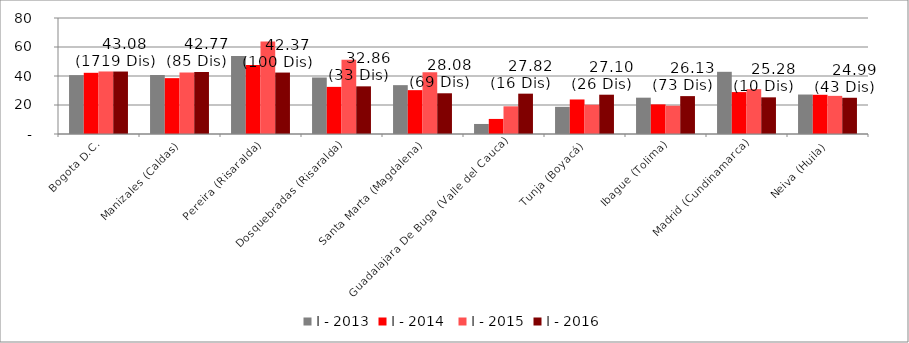
| Category | I - 2013 | I - 2014  | I - 2015 | I - 2016 |
|---|---|---|---|---|
| Bogota D.C. | 40.603 | 42.202 | 43.128 | 43.083 |
| Manizales (Caldas) | 40.693 | 38.515 | 42.413 | 42.769 |
| Pereira (Risaralda) | 53.794 | 47.516 | 63.878 | 42.371 |
| Dosquebradas (Risaralda) | 38.979 | 32.5 | 51.289 | 32.864 |
| Santa Marta (Magdalena) | 33.691 | 30.235 | 42.586 | 28.084 |
| Guadalajara De Buga (Valle del Cauca) | 6.92 | 10.396 | 19.089 | 27.819 |
| Tunja (Boyacá) | 18.742 | 23.807 | 20.176 | 27.101 |
| Ibague (Tolima) | 25.049 | 20.43 | 19.511 | 26.127 |
| Madrid (Cundinamarca) | 42.895 | 28.905 | 30.917 | 25.278 |
| Neiva (Huila) | 27.224 | 27.048 | 26.299 | 24.991 |